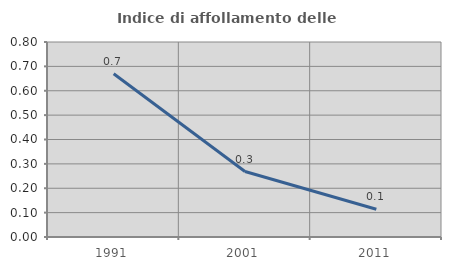
| Category | Indice di affollamento delle abitazioni  |
|---|---|
| 1991.0 | 0.67 |
| 2001.0 | 0.268 |
| 2011.0 | 0.114 |